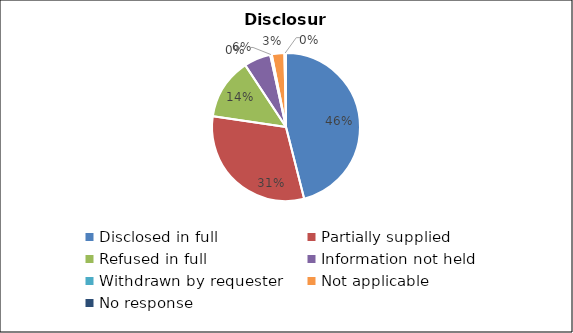
| Category | Series 0 |
|---|---|
| Disclosed in full | 134 |
| Partially supplied | 91 |
| Refused in full | 39 |
| Information not held | 17 |
| Withdrawn by requester | 1 |
| Not applicable | 8 |
| No response | 1 |